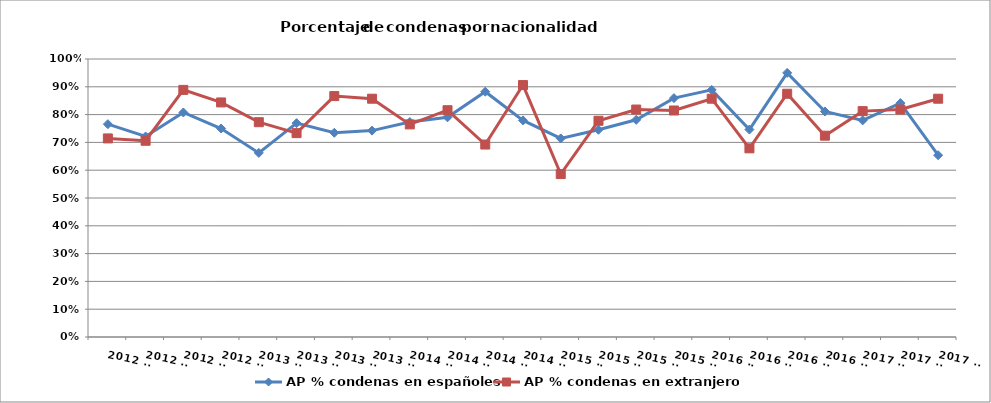
| Category | AP % condenas en españoles | AP % condenas en extranjeros |
|---|---|---|
| 2012 T1 | 0.766 | 0.714 |
| 2012 T2 | 0.721 | 0.706 |
| 2012 T3 | 0.808 | 0.889 |
| 2012 T4 | 0.75 | 0.844 |
| 2013 T1 | 0.662 | 0.773 |
| 2013 T2 | 0.769 | 0.733 |
| 2013 T3 | 0.735 | 0.867 |
| 2013 T4 | 0.742 | 0.857 |
| 2014 T1 | 0.773 | 0.765 |
| 2014 T2 | 0.79 | 0.816 |
| 2014 T3 | 0.882 | 0.692 |
| 2014 T4 | 0.779 | 0.906 |
| 2015 T1 | 0.714 | 0.586 |
| 2015 T2 | 0.745 | 0.778 |
| 2015 T3 | 0.781 | 0.818 |
| 2015 T4 | 0.859 | 0.815 |
| 2016 T1 | 0.889 | 0.857 |
| 2016 T2 | 0.746 | 0.679 |
| 2016 T3 | 0.95 | 0.875 |
| 2016 T4 | 0.811 | 0.724 |
| 2017 T1 | 0.779 | 0.812 |
| 2017 T2 | 0.841 | 0.818 |
| 2017 T3 | 0.654 | 0.857 |